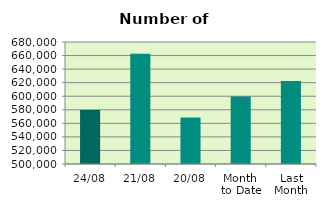
| Category | Series 0 |
|---|---|
| 24/08 | 579830 |
| 21/08 | 662572 |
| 20/08 | 568640 |
| Month 
to Date | 599445.375 |
| Last
Month | 622411.826 |